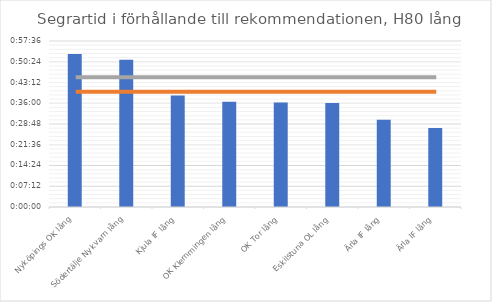
| Category | H80 tid |
|---|---|
| Nyköpings OK lång | 0.037 |
| Södertälje Nykvarn lång | 0.036 |
| Kjula IF lång | 0.027 |
| OK Klemmingen lång | 0.025 |
| OK Tor lång | 0.025 |
| Eskilstuna OL lång | 0.025 |
| Ärla IF lång | 0.021 |
| Ärla IF lång | 0.019 |